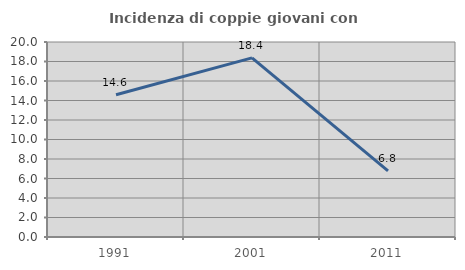
| Category | Incidenza di coppie giovani con figli |
|---|---|
| 1991.0 | 14.583 |
| 2001.0 | 18.367 |
| 2011.0 | 6.78 |